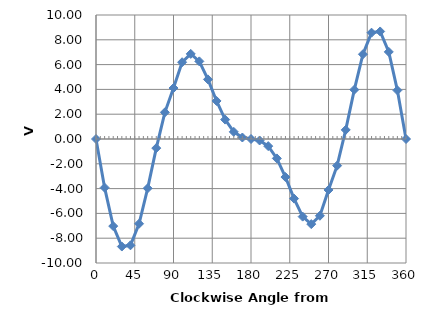
| Category | Series 0 |
|---|---|
| 0.0 | 0 |
| 10.0 | -3.923 |
| 20.0 | -7.024 |
| 30.0 | -8.672 |
| 40.0 | -8.574 |
| 50.0 | -6.835 |
| 60.0 | -3.977 |
| 70.0 | -0.734 |
| 80.0 | 2.148 |
| 90.0 | 4.11 |
| 100.0 | 6.192 |
| 110.0 | 6.864 |
| 120.0 | 6.26 |
| 130.0 | 4.807 |
| 140.0 | 3.068 |
| 150.0 | 1.565 |
| 160.0 | 0.575 |
| 170.0 | 0.12 |
| 180.0 | 0 |
| 190.0 | -0.12 |
| 200.0 | -0.575 |
| 210.0 | -1.565 |
| 220.0 | -3.068 |
| 230.0 | -4.807 |
| 240.0 | -6.26 |
| 250.0 | -6.864 |
| 260.0 | -6.192 |
| 270.0 | -4.11 |
| 280.0 | -2.148 |
| 290.0 | 0.734 |
| 300.0 | 3.977 |
| 310.0 | 6.835 |
| 320.0 | 8.574 |
| 330.0 | 8.672 |
| 340.0 | 7.024 |
| 350.0 | 3.923 |
| 360.0 | 0 |